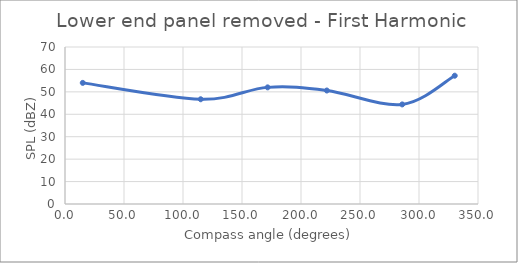
| Category | Series 0 |
|---|---|
| 15.06445125542554 | 54 |
| 115.00449447818254 | 46.7 |
| 171.7068171198818 | 52 |
| 221.8691292075067 | 50.6 |
| 285.7828166838848 | 44.4 |
| 330.28010595813004 | 57.2 |